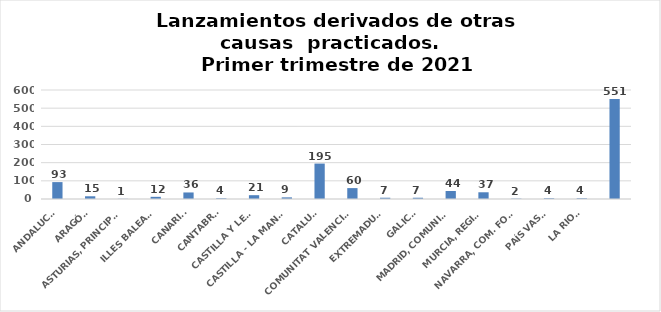
| Category | 616 |
|---|---|
| ANDALUCÍA | 93 |
| ARAGÓN | 15 |
| ASTURIAS, PRINCIPADO | 1 |
| ILLES BALEARS | 12 |
| CANARIAS | 36 |
| CANTABRIA | 4 |
| CASTILLA Y LEÓN | 21 |
| CASTILLA - LA MANCHA | 9 |
| CATALUÑA | 195 |
| COMUNITAT VALENCIANA | 60 |
| EXTREMADURA | 7 |
| GALICIA | 7 |
| MADRID, COMUNIDAD | 44 |
| MURCIA, REGIÓN | 37 |
| NAVARRA, COM. FORAL | 2 |
| PAÍS VASCO | 4 |
| LA RIOJA | 4 |